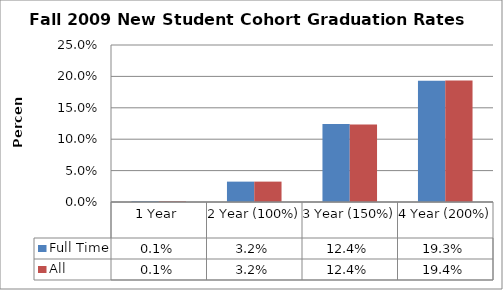
| Category | Full Time | All  |
|---|---|---|
| 1 Year | 0.001 | 0.001 |
| 2 Year (100%) | 0.032 | 0.032 |
| 3 Year (150%) | 0.124 | 0.124 |
| 4 Year (200%) | 0.193 | 0.194 |